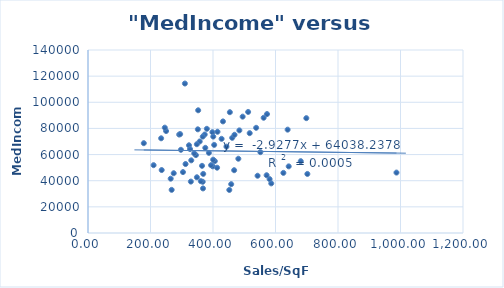
| Category | MedIncome |
|---|---|
| 701.97 | 45177 |
| 209.93 | 51888 |
| 364.92 | 51379 |
| 443.04 | 66081 |
| 399.2 | 50999 |
| 264.64 | 41562 |
| 571.59 | 44196 |
| 642.25 | 50975 |
| 461.45 | 72808 |
| 638.82 | 79070 |
| 484.38 | 78497 |
| 581.09 | 41245 |
| 267.71 | 33003 |
| 572.84 | 90988 |
| 586.48 | 37950 |
| 368.73 | 45206 |
| 351.47 | 79312 |
| 458.24 | 37345 |
| 987.12 | 46226 |
| 357.45 | 70024 |
| 405.77 | 54982 |
| 680.8 | 54932 |
| 368.02 | 34097 |
| 303.95 | 46593 |
| 393.9 | 51893 |
| 562.12 | 88162 |
| 494.88 | 89016 |
| 310.07 | 114353 |
| 373.46 | 75366 |
| 235.81 | 48163 |
| 413.08 | 49956 |
| 625.22 | 45990 |
| 274.3 | 45723 |
| 542.62 | 43800 |
| 178.56 | 68711 |
| 375.33 | 65150 |
| 329.09 | 39329 |
| 297.37 | 63657 |
| 323.17 | 67099 |
| 468.84 | 75151 |
| 352.57 | 93876 |
| 380.34 | 79701 |
| 398.12 | 77115 |
| 312.15 | 52766 |
| 452.16 | 32929 |
| 698.64 | 87863 |
| 367.19 | 73752 |
| 431.93 | 85366 |
| 367.06 | 39180 |
| 400.53 | 56077 |
| 414.36 | 77449 |
| 481.11 | 56822 |
| 538.06 | 80470 |
| 330.48 | 55584 |
| 249.93 | 78001 |
| 291.87 | 75307 |
| 517.4 | 76375 |
| 551.58 | 61857 |
| 386.81 | 61312 |
| 427.5 | 72040 |
| 453.94 | 92414 |
| 512.46 | 92602 |
| 345.27 | 59599 |
| 234.04 | 72453 |
| 348.33 | 67925 |
| 348.47 | 42631 |
| 294.95 | 75652 |
| 361.14 | 39650 |
| 467.71 | 48033 |
| 403.78 | 67403 |
| 245.74 | 80597 |
| 339.94 | 60928 |
| 400.82 | 73762 |
| 326.54 | 64225 |